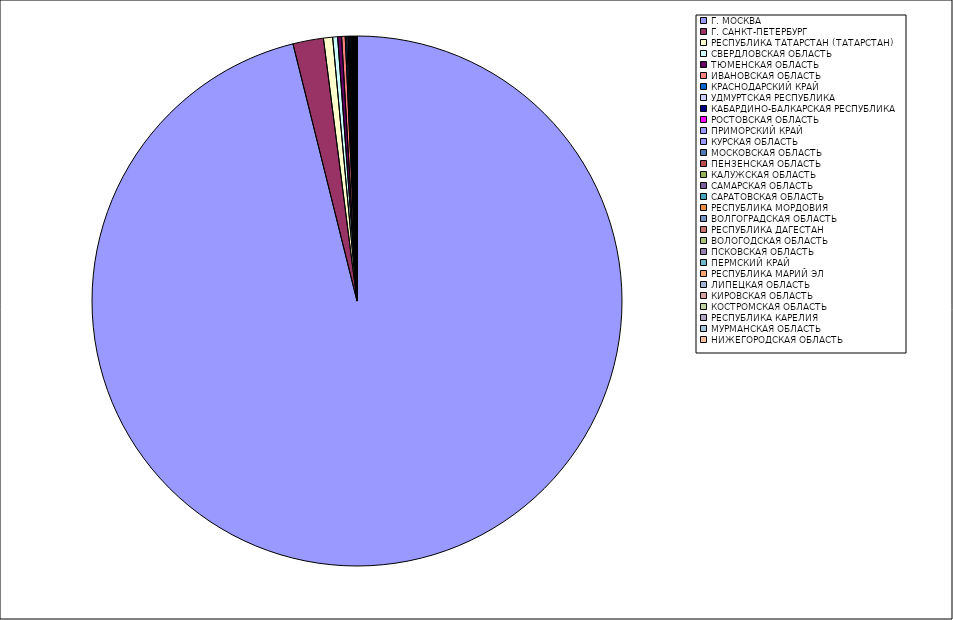
| Category | Оборот |
|---|---|
| Г. МОСКВА | 96.069 |
| Г. САНКТ-ПЕТЕРБУРГ | 1.861 |
| РЕСПУБЛИКА ТАТАРСТАН (ТАТАРСТАН) | 0.558 |
| СВЕРДЛОВСКАЯ ОБЛАСТЬ | 0.299 |
| ТЮМЕНСКАЯ ОБЛАСТЬ | 0.24 |
| ИВАНОВСКАЯ ОБЛАСТЬ | 0.217 |
| КРАСНОДАРСКИЙ КРАЙ | 0.087 |
| УДМУРТСКАЯ РЕСПУБЛИКА | 0.076 |
| КАБАРДИНО-БАЛКАРСКАЯ РЕСПУБЛИКА | 0.066 |
| РОСТОВСКАЯ ОБЛАСТЬ | 0.055 |
| ПРИМОРСКИЙ КРАЙ | 0.055 |
| КУРСКАЯ ОБЛАСТЬ | 0.051 |
| МОСКОВСКАЯ ОБЛАСТЬ | 0.044 |
| ПЕНЗЕНСКАЯ ОБЛАСТЬ | 0.038 |
| КАЛУЖСКАЯ ОБЛАСТЬ | 0.03 |
| САМАРСКАЯ ОБЛАСТЬ | 0.024 |
| САРАТОВСКАЯ ОБЛАСТЬ | 0.024 |
| РЕСПУБЛИКА МОРДОВИЯ | 0.019 |
| ВОЛГОГРАДСКАЯ ОБЛАСТЬ | 0.017 |
| РЕСПУБЛИКА ДАГЕСТАН | 0.016 |
| ВОЛОГОДСКАЯ ОБЛАСТЬ | 0.014 |
| ПСКОВСКАЯ ОБЛАСТЬ | 0.014 |
| ПЕРМСКИЙ КРАЙ | 0.013 |
| РЕСПУБЛИКА МАРИЙ ЭЛ | 0.013 |
| ЛИПЕЦКАЯ ОБЛАСТЬ | 0.013 |
| КИРОВСКАЯ ОБЛАСТЬ | 0.012 |
| КОСТРОМСКАЯ ОБЛАСТЬ | 0.008 |
| РЕСПУБЛИКА КАРЕЛИЯ | 0.007 |
| МУРМАНСКАЯ ОБЛАСТЬ | 0.006 |
| НИЖЕГОРОДСКАЯ ОБЛАСТЬ | 0.005 |